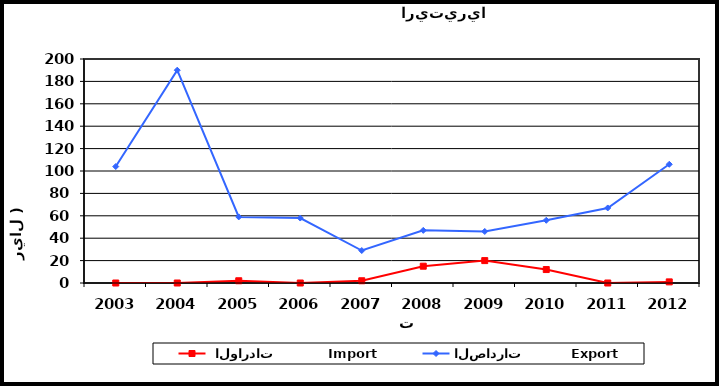
| Category |  الواردات           Import | الصادرات          Export |
|---|---|---|
| 2003.0 | 0 | 104 |
| 2004.0 | 0 | 190 |
| 2005.0 | 2 | 59 |
| 2006.0 | 0 | 58 |
| 2007.0 | 2 | 29 |
| 2008.0 | 15 | 47 |
| 2009.0 | 20 | 46 |
| 2010.0 | 12 | 56 |
| 2011.0 | 0 | 67 |
| 2012.0 | 1 | 106 |